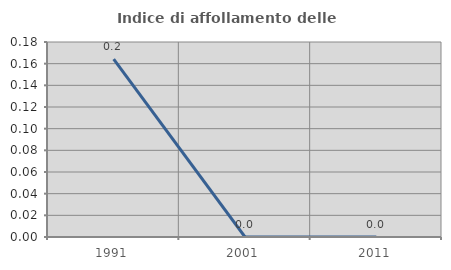
| Category | Indice di affollamento delle abitazioni  |
|---|---|
| 1991.0 | 0.164 |
| 2001.0 | 0 |
| 2011.0 | 0 |